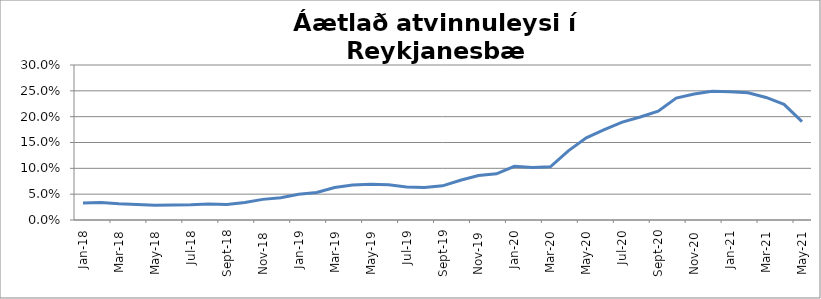
| Category | Series 0 |
|---|---|
| 2018-01-01 | 0.033 |
| 2018-02-01 | 0.034 |
| 2018-03-01 | 0.031 |
| 2018-04-01 | 0.03 |
| 2018-05-01 | 0.028 |
| 2018-06-01 | 0.029 |
| 2018-07-01 | 0.03 |
| 2018-08-01 | 0.031 |
| 2018-09-01 | 0.03 |
| 2018-10-01 | 0.034 |
| 2018-11-01 | 0.04 |
| 2018-12-01 | 0.043 |
| 2019-01-01 | 0.05 |
| 2019-02-01 | 0.053 |
| 2019-03-01 | 0.063 |
| 2019-04-01 | 0.068 |
| 2019-05-01 | 0.069 |
| 2019-06-01 | 0.068 |
| 2019-07-01 | 0.064 |
| 2019-08-01 | 0.063 |
| 2019-09-01 | 0.066 |
| 2019-10-01 | 0.077 |
| 2019-11-01 | 0.086 |
| 2019-12-01 | 0.089 |
| 2020-01-01 | 0.104 |
| 2020-02-01 | 0.102 |
| 2020-03-01 | 0.103 |
| 2020-04-01 | 0.134 |
| 2020-05-01 | 0.159 |
| 2020-06-01 | 0.175 |
| 2020-07-01 | 0.189 |
| 2020-08-01 | 0.199 |
| 2020-09-01 | 0.21 |
| 2020-10-01 | 0.236 |
| 2020-11-01 | 0.244 |
| 2020-12-01 | 0.249 |
| 2021-01-01 | 0.248 |
| 2021-02-01 | 0.246 |
| 2021-03-01 | 0.237 |
| 2021-04-01 | 0.224 |
| 2021-05-01 | 0.19 |